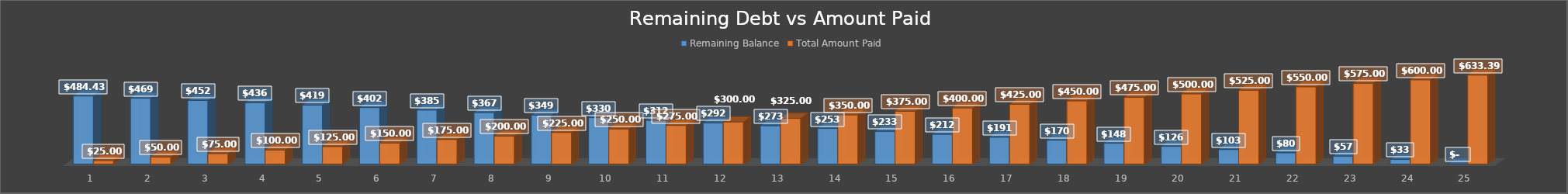
| Category | Remaining Balance | Total Amount Paid |
|---|---|---|
| 0 | 484.425 | 25 |
| 1 | 468.556 | 50 |
| 2 | 452.389 | 75 |
| 3 | 435.916 | 100 |
| 4 | 419.133 | 125 |
| 5 | 402.034 | 150 |
| 6 | 384.612 | 175 |
| 7 | 366.862 | 200 |
| 8 | 348.778 | 225 |
| 9 | 330.352 | 250 |
| 10 | 311.579 | 275 |
| 11 | 292.452 | 300 |
| 12 | 272.965 | 325 |
| 13 | 253.111 | 350 |
| 14 | 232.882 | 375 |
| 15 | 212.271 | 400 |
| 16 | 191.273 | 425 |
| 17 | 169.878 | 450 |
| 18 | 148.08 | 475 |
| 19 | 125.872 | 500 |
| 20 | 103.244 | 525 |
| 21 | 80.191 | 550 |
| 22 | 56.702 | 575 |
| 23 | 32.771 | 600 |
| 24 | 0 | 633.389 |